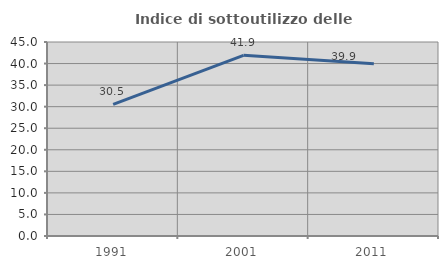
| Category | Indice di sottoutilizzo delle abitazioni  |
|---|---|
| 1991.0 | 30.534 |
| 2001.0 | 41.912 |
| 2011.0 | 39.946 |